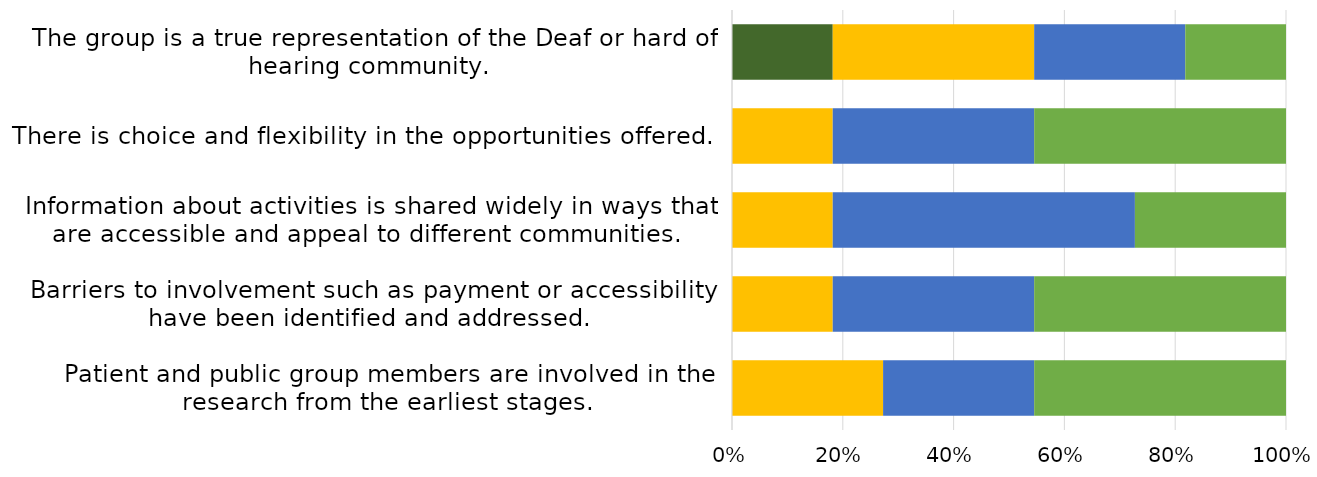
| Category | Strongly Disagree 
 | Disagree
 | Neither agree nor disagree
 | Agree
 | Strongly agree
 |
|---|---|---|---|---|---|
| Patient and public group members are involved in the research from the earliest stages. 
 | 0 | 0 | 0.273 | 0.273 | 0.455 |
| Barriers to involvement such as payment or accessibility have been identified and addressed. 
 | 0 | 0 | 0.182 | 0.364 | 0.455 |
| Information about activities is shared widely in ways that are accessible and appeal to different communities. 
 | 0 | 0 | 0.182 | 0.545 | 0.273 |
| There is choice and flexibility in the opportunities offered. 
 | 0 | 0 | 0.182 | 0.364 | 0.455 |
| The group is a true representation of the Deaf or hard of hearing community. 
 | 0 | 0.182 | 0.364 | 0.273 | 0.182 |